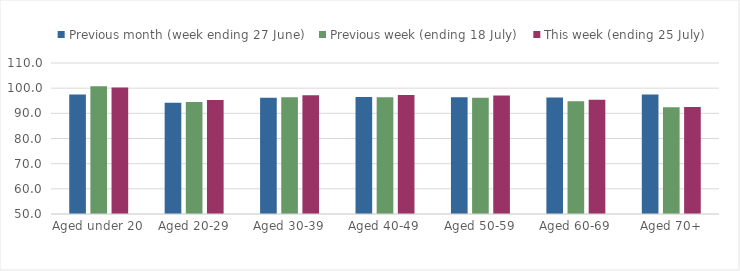
| Category | Previous month (week ending 27 June) | Previous week (ending 18 July) | This week (ending 25 July) |
|---|---|---|---|
| Aged under 20 | 97.435 | 100.795 | 100.303 |
| Aged 20-29 | 94.201 | 94.53 | 95.253 |
| Aged 30-39 | 96.225 | 96.394 | 97.162 |
| Aged 40-49 | 96.482 | 96.362 | 97.274 |
| Aged 50-59 | 96.438 | 96.165 | 97.06 |
| Aged 60-69 | 96.279 | 94.841 | 95.352 |
| Aged 70+ | 97.475 | 92.378 | 92.505 |